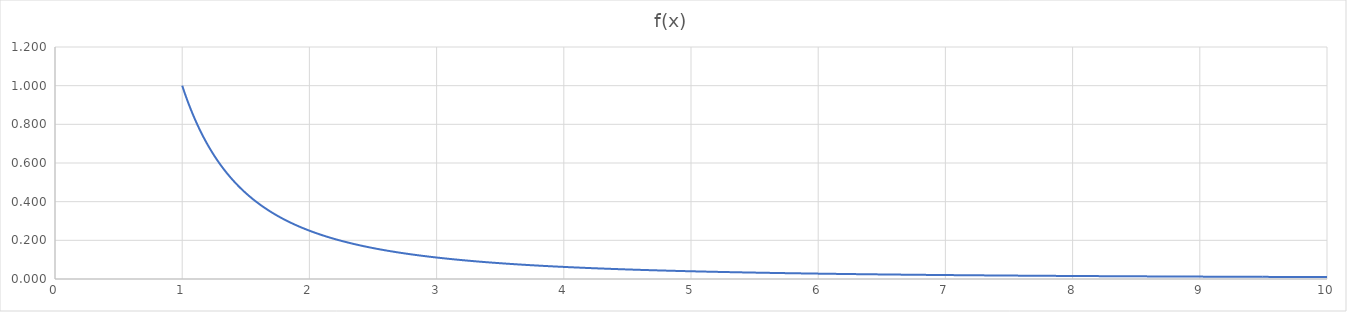
| Category | Series 0 |
|---|---|
| 1.0 | 1 |
| 1.01 | 0.98 |
| 1.02 | 0.961 |
| 1.03 | 0.943 |
| 1.04 | 0.925 |
| 1.05 | 0.907 |
| 1.06 | 0.89 |
| 1.07 | 0.873 |
| 1.08 | 0.857 |
| 1.09 | 0.842 |
| 1.1 | 0.826 |
| 1.11 | 0.812 |
| 1.12 | 0.797 |
| 1.13 | 0.783 |
| 1.14 | 0.769 |
| 1.15 | 0.756 |
| 1.16 | 0.743 |
| 1.17 | 0.731 |
| 1.18 | 0.718 |
| 1.19 | 0.706 |
| 1.2 | 0.694 |
| 1.21 | 0.683 |
| 1.22 | 0.672 |
| 1.23 | 0.661 |
| 1.24 | 0.65 |
| 1.25 | 0.64 |
| 1.26 | 0.63 |
| 1.27 | 0.62 |
| 1.28 | 0.61 |
| 1.29 | 0.601 |
| 1.3 | 0.592 |
| 1.31 | 0.583 |
| 1.32 | 0.574 |
| 1.33 | 0.565 |
| 1.34 | 0.557 |
| 1.35 | 0.549 |
| 1.36 | 0.541 |
| 1.37 | 0.533 |
| 1.38 | 0.525 |
| 1.39 | 0.518 |
| 1.4 | 0.51 |
| 1.41 | 0.503 |
| 1.42 | 0.496 |
| 1.43 | 0.489 |
| 1.44 | 0.482 |
| 1.45 | 0.476 |
| 1.46 | 0.469 |
| 1.47 | 0.463 |
| 1.48 | 0.457 |
| 1.49 | 0.45 |
| 1.5 | 0.444 |
| 1.51 | 0.439 |
| 1.52 | 0.433 |
| 1.53 | 0.427 |
| 1.54 | 0.422 |
| 1.55 | 0.416 |
| 1.56 | 0.411 |
| 1.57 | 0.406 |
| 1.58 | 0.401 |
| 1.59 | 0.396 |
| 1.6 | 0.391 |
| 1.61 | 0.386 |
| 1.62 | 0.381 |
| 1.63 | 0.376 |
| 1.64 | 0.372 |
| 1.65 | 0.367 |
| 1.66 | 0.363 |
| 1.67 | 0.359 |
| 1.68 | 0.354 |
| 1.69 | 0.35 |
| 1.7 | 0.346 |
| 1.71 | 0.342 |
| 1.72 | 0.338 |
| 1.73 | 0.334 |
| 1.74 | 0.33 |
| 1.75 | 0.327 |
| 1.76 | 0.323 |
| 1.77 | 0.319 |
| 1.78 | 0.316 |
| 1.79 | 0.312 |
| 1.8 | 0.309 |
| 1.81 | 0.305 |
| 1.82 | 0.302 |
| 1.83 | 0.299 |
| 1.84 | 0.295 |
| 1.85 | 0.292 |
| 1.86 | 0.289 |
| 1.87 | 0.286 |
| 1.88 | 0.283 |
| 1.89 | 0.28 |
| 1.9 | 0.277 |
| 1.91 | 0.274 |
| 1.92 | 0.271 |
| 1.93 | 0.268 |
| 1.94 | 0.266 |
| 1.95 | 0.263 |
| 1.96 | 0.26 |
| 1.97 | 0.258 |
| 1.98 | 0.255 |
| 1.99 | 0.253 |
| 2.0 | 0.25 |
| 2.01 | 0.248 |
| 2.02 | 0.245 |
| 2.03 | 0.243 |
| 2.04 | 0.24 |
| 2.05 | 0.238 |
| 2.06 | 0.236 |
| 2.07 | 0.233 |
| 2.08 | 0.231 |
| 2.09 | 0.229 |
| 2.1 | 0.227 |
| 2.11 | 0.225 |
| 2.12 | 0.222 |
| 2.13 | 0.22 |
| 2.14 | 0.218 |
| 2.15 | 0.216 |
| 2.16 | 0.214 |
| 2.17 | 0.212 |
| 2.18 | 0.21 |
| 2.19 | 0.209 |
| 2.2 | 0.207 |
| 2.21 | 0.205 |
| 2.22 | 0.203 |
| 2.23 | 0.201 |
| 2.24 | 0.199 |
| 2.25 | 0.198 |
| 2.26 | 0.196 |
| 2.27 | 0.194 |
| 2.28 | 0.192 |
| 2.29 | 0.191 |
| 2.3 | 0.189 |
| 2.31 | 0.187 |
| 2.32 | 0.186 |
| 2.33 | 0.184 |
| 2.34 | 0.183 |
| 2.35 | 0.181 |
| 2.36 | 0.18 |
| 2.37 | 0.178 |
| 2.38 | 0.177 |
| 2.39 | 0.175 |
| 2.4 | 0.174 |
| 2.41 | 0.172 |
| 2.42 | 0.171 |
| 2.43 | 0.169 |
| 2.44 | 0.168 |
| 2.45 | 0.167 |
| 2.46 | 0.165 |
| 2.47 | 0.164 |
| 2.48 | 0.163 |
| 2.49 | 0.161 |
| 2.5 | 0.16 |
| 2.51 | 0.159 |
| 2.52 | 0.157 |
| 2.53 | 0.156 |
| 2.54 | 0.155 |
| 2.55 | 0.154 |
| 2.56 | 0.153 |
| 2.57 | 0.151 |
| 2.58 | 0.15 |
| 2.59 | 0.149 |
| 2.6 | 0.148 |
| 2.61 | 0.147 |
| 2.62 | 0.146 |
| 2.63 | 0.145 |
| 2.64 | 0.143 |
| 2.65 | 0.142 |
| 2.66 | 0.141 |
| 2.67 | 0.14 |
| 2.68 | 0.139 |
| 2.69 | 0.138 |
| 2.7 | 0.137 |
| 2.71 | 0.136 |
| 2.72 | 0.135 |
| 2.73 | 0.134 |
| 2.74 | 0.133 |
| 2.75 | 0.132 |
| 2.76 | 0.131 |
| 2.77 | 0.13 |
| 2.78 | 0.129 |
| 2.79 | 0.128 |
| 2.8 | 0.128 |
| 2.81 | 0.127 |
| 2.82 | 0.126 |
| 2.83 | 0.125 |
| 2.84 | 0.124 |
| 2.85 | 0.123 |
| 2.86 | 0.122 |
| 2.87 | 0.121 |
| 2.88 | 0.121 |
| 2.89 | 0.12 |
| 2.9 | 0.119 |
| 2.91 | 0.118 |
| 2.92 | 0.117 |
| 2.93 | 0.116 |
| 2.94 | 0.116 |
| 2.95 | 0.115 |
| 2.96 | 0.114 |
| 2.97 | 0.113 |
| 2.98 | 0.113 |
| 2.99 | 0.112 |
| 3.0 | 0.111 |
| 3.01 | 0.11 |
| 3.02 | 0.11 |
| 3.03 | 0.109 |
| 3.04 | 0.108 |
| 3.05 | 0.107 |
| 3.06 | 0.107 |
| 3.07 | 0.106 |
| 3.08 | 0.105 |
| 3.09 | 0.105 |
| 3.1 | 0.104 |
| 3.11 | 0.103 |
| 3.12 | 0.103 |
| 3.13 | 0.102 |
| 3.14 | 0.101 |
| 3.15 | 0.101 |
| 3.16 | 0.1 |
| 3.17 | 0.1 |
| 3.18 | 0.099 |
| 3.19 | 0.098 |
| 3.2 | 0.098 |
| 3.21 | 0.097 |
| 3.22 | 0.096 |
| 3.23 | 0.096 |
| 3.24 | 0.095 |
| 3.25 | 0.095 |
| 3.26 | 0.094 |
| 3.27 | 0.094 |
| 3.28 | 0.093 |
| 3.29 | 0.092 |
| 3.3 | 0.092 |
| 3.31 | 0.091 |
| 3.32 | 0.091 |
| 3.33 | 0.09 |
| 3.34 | 0.09 |
| 3.35 | 0.089 |
| 3.36 | 0.089 |
| 3.37 | 0.088 |
| 3.38 | 0.088 |
| 3.39 | 0.087 |
| 3.4 | 0.087 |
| 3.41 | 0.086 |
| 3.42 | 0.085 |
| 3.43 | 0.085 |
| 3.44 | 0.085 |
| 3.45 | 0.084 |
| 3.46 | 0.084 |
| 3.47 | 0.083 |
| 3.48 | 0.083 |
| 3.49 | 0.082 |
| 3.5 | 0.082 |
| 3.51 | 0.081 |
| 3.52 | 0.081 |
| 3.53 | 0.08 |
| 3.54 | 0.08 |
| 3.55 | 0.079 |
| 3.56 | 0.079 |
| 3.57 | 0.078 |
| 3.58 | 0.078 |
| 3.59 | 0.078 |
| 3.6 | 0.077 |
| 3.61 | 0.077 |
| 3.62 | 0.076 |
| 3.63 | 0.076 |
| 3.64 | 0.075 |
| 3.65 | 0.075 |
| 3.66 | 0.075 |
| 3.67 | 0.074 |
| 3.68 | 0.074 |
| 3.69 | 0.073 |
| 3.7 | 0.073 |
| 3.71 | 0.073 |
| 3.72 | 0.072 |
| 3.73 | 0.072 |
| 3.74 | 0.071 |
| 3.75 | 0.071 |
| 3.76 | 0.071 |
| 3.77 | 0.07 |
| 3.78 | 0.07 |
| 3.79 | 0.07 |
| 3.8 | 0.069 |
| 3.81 | 0.069 |
| 3.82 | 0.069 |
| 3.83 | 0.068 |
| 3.84 | 0.068 |
| 3.85 | 0.067 |
| 3.86 | 0.067 |
| 3.87 | 0.067 |
| 3.88 | 0.066 |
| 3.89 | 0.066 |
| 3.9 | 0.066 |
| 3.91 | 0.065 |
| 3.92 | 0.065 |
| 3.93 | 0.065 |
| 3.94 | 0.064 |
| 3.95 | 0.064 |
| 3.96 | 0.064 |
| 3.97 | 0.063 |
| 3.98 | 0.063 |
| 3.99 | 0.063 |
| 4.0 | 0.062 |
| 4.01 | 0.062 |
| 4.02 | 0.062 |
| 4.03 | 0.062 |
| 4.04 | 0.061 |
| 4.05 | 0.061 |
| 4.06 | 0.061 |
| 4.07 | 0.06 |
| 4.08 | 0.06 |
| 4.09 | 0.06 |
| 4.1 | 0.059 |
| 4.11 | 0.059 |
| 4.12 | 0.059 |
| 4.13 | 0.059 |
| 4.14 | 0.058 |
| 4.15 | 0.058 |
| 4.16 | 0.058 |
| 4.17 | 0.058 |
| 4.18 | 0.057 |
| 4.19 | 0.057 |
| 4.2 | 0.057 |
| 4.21 | 0.056 |
| 4.22 | 0.056 |
| 4.23 | 0.056 |
| 4.24 | 0.056 |
| 4.25 | 0.055 |
| 4.26 | 0.055 |
| 4.27 | 0.055 |
| 4.28 | 0.055 |
| 4.29 | 0.054 |
| 4.3 | 0.054 |
| 4.31 | 0.054 |
| 4.32 | 0.054 |
| 4.33 | 0.053 |
| 4.34 | 0.053 |
| 4.35 | 0.053 |
| 4.36 | 0.053 |
| 4.37 | 0.052 |
| 4.38 | 0.052 |
| 4.39 | 0.052 |
| 4.4 | 0.052 |
| 4.41 | 0.051 |
| 4.42 | 0.051 |
| 4.43 | 0.051 |
| 4.44 | 0.051 |
| 4.45 | 0.05 |
| 4.46 | 0.05 |
| 4.47 | 0.05 |
| 4.48 | 0.05 |
| 4.49 | 0.05 |
| 4.5 | 0.049 |
| 4.51 | 0.049 |
| 4.52 | 0.049 |
| 4.53 | 0.049 |
| 4.54 | 0.049 |
| 4.55 | 0.048 |
| 4.56 | 0.048 |
| 4.57 | 0.048 |
| 4.58 | 0.048 |
| 4.59 | 0.047 |
| 4.6 | 0.047 |
| 4.61 | 0.047 |
| 4.62 | 0.047 |
| 4.63 | 0.047 |
| 4.64 | 0.046 |
| 4.65 | 0.046 |
| 4.66 | 0.046 |
| 4.67 | 0.046 |
| 4.68 | 0.046 |
| 4.69 | 0.045 |
| 4.7 | 0.045 |
| 4.71 | 0.045 |
| 4.72 | 0.045 |
| 4.73 | 0.045 |
| 4.74 | 0.045 |
| 4.75 | 0.044 |
| 4.76 | 0.044 |
| 4.77 | 0.044 |
| 4.78 | 0.044 |
| 4.79 | 0.044 |
| 4.8 | 0.043 |
| 4.81 | 0.043 |
| 4.82 | 0.043 |
| 4.83 | 0.043 |
| 4.84 | 0.043 |
| 4.85 | 0.043 |
| 4.86 | 0.042 |
| 4.87 | 0.042 |
| 4.88 | 0.042 |
| 4.89 | 0.042 |
| 4.9 | 0.042 |
| 4.91 | 0.041 |
| 4.92 | 0.041 |
| 4.93 | 0.041 |
| 4.94 | 0.041 |
| 4.95 | 0.041 |
| 4.96 | 0.041 |
| 4.97 | 0.04 |
| 4.98 | 0.04 |
| 4.99 | 0.04 |
| 5.0 | 0.04 |
| 5.01 | 0.04 |
| 5.02 | 0.04 |
| 5.03 | 0.04 |
| 5.04 | 0.039 |
| 5.05 | 0.039 |
| 5.06 | 0.039 |
| 5.07 | 0.039 |
| 5.08 | 0.039 |
| 5.09 | 0.039 |
| 5.1 | 0.038 |
| 5.11 | 0.038 |
| 5.12 | 0.038 |
| 5.13 | 0.038 |
| 5.14 | 0.038 |
| 5.15 | 0.038 |
| 5.16 | 0.038 |
| 5.17 | 0.037 |
| 5.18 | 0.037 |
| 5.19 | 0.037 |
| 5.2 | 0.037 |
| 5.21 | 0.037 |
| 5.22 | 0.037 |
| 5.23 | 0.037 |
| 5.24 | 0.036 |
| 5.25 | 0.036 |
| 5.26 | 0.036 |
| 5.27 | 0.036 |
| 5.28 | 0.036 |
| 5.29 | 0.036 |
| 5.3 | 0.036 |
| 5.31 | 0.035 |
| 5.32 | 0.035 |
| 5.33 | 0.035 |
| 5.34 | 0.035 |
| 5.35 | 0.035 |
| 5.36 | 0.035 |
| 5.37 | 0.035 |
| 5.38 | 0.035 |
| 5.39 | 0.034 |
| 5.4 | 0.034 |
| 5.41 | 0.034 |
| 5.42 | 0.034 |
| 5.43 | 0.034 |
| 5.44 | 0.034 |
| 5.45 | 0.034 |
| 5.46 | 0.034 |
| 5.47 | 0.033 |
| 5.48 | 0.033 |
| 5.49 | 0.033 |
| 5.5 | 0.033 |
| 5.51 | 0.033 |
| 5.52 | 0.033 |
| 5.53 | 0.033 |
| 5.54 | 0.033 |
| 5.55 | 0.032 |
| 5.56 | 0.032 |
| 5.57 | 0.032 |
| 5.58 | 0.032 |
| 5.59 | 0.032 |
| 5.6 | 0.032 |
| 5.61 | 0.032 |
| 5.62 | 0.032 |
| 5.63 | 0.032 |
| 5.64 | 0.031 |
| 5.65 | 0.031 |
| 5.66 | 0.031 |
| 5.67 | 0.031 |
| 5.68 | 0.031 |
| 5.69 | 0.031 |
| 5.7 | 0.031 |
| 5.71 | 0.031 |
| 5.72 | 0.031 |
| 5.73 | 0.03 |
| 5.74 | 0.03 |
| 5.75 | 0.03 |
| 5.76 | 0.03 |
| 5.77 | 0.03 |
| 5.78 | 0.03 |
| 5.79 | 0.03 |
| 5.8 | 0.03 |
| 5.81 | 0.03 |
| 5.82 | 0.03 |
| 5.83 | 0.029 |
| 5.84 | 0.029 |
| 5.85 | 0.029 |
| 5.86 | 0.029 |
| 5.87 | 0.029 |
| 5.88 | 0.029 |
| 5.89 | 0.029 |
| 5.9 | 0.029 |
| 5.91 | 0.029 |
| 5.92 | 0.029 |
| 5.93 | 0.028 |
| 5.94 | 0.028 |
| 5.95 | 0.028 |
| 5.96 | 0.028 |
| 5.97 | 0.028 |
| 5.98 | 0.028 |
| 5.99 | 0.028 |
| 6.0 | 0.028 |
| 6.01 | 0.028 |
| 6.02 | 0.028 |
| 6.03 | 0.028 |
| 6.04 | 0.027 |
| 6.05 | 0.027 |
| 6.06 | 0.027 |
| 6.07 | 0.027 |
| 6.08 | 0.027 |
| 6.09 | 0.027 |
| 6.1 | 0.027 |
| 6.11 | 0.027 |
| 6.12 | 0.027 |
| 6.13 | 0.027 |
| 6.14 | 0.027 |
| 6.15 | 0.026 |
| 6.16 | 0.026 |
| 6.17 | 0.026 |
| 6.18000000000001 | 0.026 |
| 6.19 | 0.026 |
| 6.2 | 0.026 |
| 6.21 | 0.026 |
| 6.22 | 0.026 |
| 6.23 | 0.026 |
| 6.24 | 0.026 |
| 6.25 | 0.026 |
| 6.26000000000001 | 0.026 |
| 6.27 | 0.025 |
| 6.28 | 0.025 |
| 6.29 | 0.025 |
| 6.3 | 0.025 |
| 6.31 | 0.025 |
| 6.32 | 0.025 |
| 6.33 | 0.025 |
| 6.34000000000001 | 0.025 |
| 6.35 | 0.025 |
| 6.36 | 0.025 |
| 6.37 | 0.025 |
| 6.38 | 0.025 |
| 6.39000000000001 | 0.024 |
| 6.4 | 0.024 |
| 6.41 | 0.024 |
| 6.42000000000001 | 0.024 |
| 6.43000000000001 | 0.024 |
| 6.44 | 0.024 |
| 6.45 | 0.024 |
| 6.46 | 0.024 |
| 6.47000000000001 | 0.024 |
| 6.48 | 0.024 |
| 6.49 | 0.024 |
| 6.50000000000001 | 0.024 |
| 6.51000000000001 | 0.024 |
| 6.52 | 0.024 |
| 6.53 | 0.023 |
| 6.54 | 0.023 |
| 6.55000000000001 | 0.023 |
| 6.56 | 0.023 |
| 6.57 | 0.023 |
| 6.58000000000001 | 0.023 |
| 6.59000000000001 | 0.023 |
| 6.6 | 0.023 |
| 6.61 | 0.023 |
| 6.62 | 0.023 |
| 6.63000000000001 | 0.023 |
| 6.64000000000001 | 0.023 |
| 6.65 | 0.023 |
| 6.66000000000001 | 0.023 |
| 6.67000000000001 | 0.022 |
| 6.68000000000001 | 0.022 |
| 6.69 | 0.022 |
| 6.7 | 0.022 |
| 6.71000000000001 | 0.022 |
| 6.72000000000001 | 0.022 |
| 6.73 | 0.022 |
| 6.74000000000001 | 0.022 |
| 6.75000000000001 | 0.022 |
| 6.76000000000001 | 0.022 |
| 6.77 | 0.022 |
| 6.78 | 0.022 |
| 6.79000000000001 | 0.022 |
| 6.80000000000001 | 0.022 |
| 6.81 | 0.022 |
| 6.82000000000001 | 0.021 |
| 6.83000000000001 | 0.021 |
| 6.84000000000001 | 0.021 |
| 6.85 | 0.021 |
| 6.86 | 0.021 |
| 6.87000000000001 | 0.021 |
| 6.88000000000001 | 0.021 |
| 6.89000000000001 | 0.021 |
| 6.90000000000001 | 0.021 |
| 6.91000000000001 | 0.021 |
| 6.92000000000001 | 0.021 |
| 6.93000000000001 | 0.021 |
| 6.94 | 0.021 |
| 6.95000000000001 | 0.021 |
| 6.96000000000001 | 0.021 |
| 6.97000000000001 | 0.021 |
| 6.98000000000001 | 0.021 |
| 6.99000000000001 | 0.02 |
| 7.00000000000001 | 0.02 |
| 7.01000000000001 | 0.02 |
| 7.02 | 0.02 |
| 7.03000000000001 | 0.02 |
| 7.04000000000001 | 0.02 |
| 7.05000000000001 | 0.02 |
| 7.06000000000001 | 0.02 |
| 7.07000000000001 | 0.02 |
| 7.08000000000001 | 0.02 |
| 7.09000000000001 | 0.02 |
| 7.1 | 0.02 |
| 7.11000000000001 | 0.02 |
| 7.12000000000001 | 0.02 |
| 7.13000000000001 | 0.02 |
| 7.14000000000001 | 0.02 |
| 7.15000000000001 | 0.02 |
| 7.16000000000001 | 0.02 |
| 7.17000000000001 | 0.019 |
| 7.18000000000001 | 0.019 |
| 7.19000000000001 | 0.019 |
| 7.20000000000001 | 0.019 |
| 7.21000000000001 | 0.019 |
| 7.22000000000001 | 0.019 |
| 7.23000000000001 | 0.019 |
| 7.24000000000001 | 0.019 |
| 7.25000000000001 | 0.019 |
| 7.26000000000001 | 0.019 |
| 7.27000000000001 | 0.019 |
| 7.28000000000001 | 0.019 |
| 7.29000000000001 | 0.019 |
| 7.30000000000001 | 0.019 |
| 7.31000000000001 | 0.019 |
| 7.32000000000001 | 0.019 |
| 7.33000000000001 | 0.019 |
| 7.34000000000001 | 0.019 |
| 7.35000000000001 | 0.019 |
| 7.36000000000001 | 0.018 |
| 7.37000000000001 | 0.018 |
| 7.38000000000001 | 0.018 |
| 7.39000000000001 | 0.018 |
| 7.40000000000001 | 0.018 |
| 7.41000000000001 | 0.018 |
| 7.42000000000001 | 0.018 |
| 7.43000000000001 | 0.018 |
| 7.44000000000001 | 0.018 |
| 7.45000000000001 | 0.018 |
| 7.46000000000001 | 0.018 |
| 7.47000000000001 | 0.018 |
| 7.48000000000001 | 0.018 |
| 7.49000000000001 | 0.018 |
| 7.50000000000001 | 0.018 |
| 7.51000000000001 | 0.018 |
| 7.52000000000001 | 0.018 |
| 7.53000000000001 | 0.018 |
| 7.54000000000001 | 0.018 |
| 7.55000000000001 | 0.018 |
| 7.56000000000001 | 0.017 |
| 7.57000000000001 | 0.017 |
| 7.58000000000001 | 0.017 |
| 7.59000000000001 | 0.017 |
| 7.60000000000001 | 0.017 |
| 7.61000000000001 | 0.017 |
| 7.62000000000001 | 0.017 |
| 7.63000000000001 | 0.017 |
| 7.64000000000001 | 0.017 |
| 7.65000000000001 | 0.017 |
| 7.66000000000001 | 0.017 |
| 7.67000000000001 | 0.017 |
| 7.68000000000001 | 0.017 |
| 7.69000000000001 | 0.017 |
| 7.70000000000001 | 0.017 |
| 7.71000000000001 | 0.017 |
| 7.72000000000001 | 0.017 |
| 7.73000000000001 | 0.017 |
| 7.74000000000001 | 0.017 |
| 7.75000000000001 | 0.017 |
| 7.76000000000001 | 0.017 |
| 7.77000000000001 | 0.017 |
| 7.78000000000001 | 0.017 |
| 7.79000000000001 | 0.016 |
| 7.80000000000001 | 0.016 |
| 7.81000000000001 | 0.016 |
| 7.82000000000001 | 0.016 |
| 7.83000000000001 | 0.016 |
| 7.84000000000001 | 0.016 |
| 7.85000000000001 | 0.016 |
| 7.86000000000001 | 0.016 |
| 7.87000000000001 | 0.016 |
| 7.88000000000001 | 0.016 |
| 7.89000000000001 | 0.016 |
| 7.90000000000001 | 0.016 |
| 7.91000000000001 | 0.016 |
| 7.92000000000001 | 0.016 |
| 7.93000000000001 | 0.016 |
| 7.94000000000001 | 0.016 |
| 7.95000000000001 | 0.016 |
| 7.96000000000001 | 0.016 |
| 7.97000000000001 | 0.016 |
| 7.98000000000001 | 0.016 |
| 7.99000000000001 | 0.016 |
| 8.00000000000001 | 0.016 |
| 8.01000000000001 | 0.016 |
| 8.02000000000001 | 0.016 |
| 8.03000000000001 | 0.016 |
| 8.04000000000001 | 0.015 |
| 8.05000000000001 | 0.015 |
| 8.06000000000001 | 0.015 |
| 8.07000000000001 | 0.015 |
| 8.08000000000001 | 0.015 |
| 8.09000000000001 | 0.015 |
| 8.10000000000001 | 0.015 |
| 8.11000000000001 | 0.015 |
| 8.12000000000001 | 0.015 |
| 8.13000000000001 | 0.015 |
| 8.14000000000001 | 0.015 |
| 8.15000000000001 | 0.015 |
| 8.16000000000001 | 0.015 |
| 8.17000000000001 | 0.015 |
| 8.18000000000001 | 0.015 |
| 8.19000000000001 | 0.015 |
| 8.20000000000001 | 0.015 |
| 8.21000000000001 | 0.015 |
| 8.22000000000001 | 0.015 |
| 8.23000000000001 | 0.015 |
| 8.24000000000001 | 0.015 |
| 8.25000000000001 | 0.015 |
| 8.26000000000001 | 0.015 |
| 8.27000000000001 | 0.015 |
| 8.28000000000001 | 0.015 |
| 8.29000000000001 | 0.015 |
| 8.30000000000001 | 0.015 |
| 8.31000000000001 | 0.014 |
| 8.32000000000001 | 0.014 |
| 8.33000000000001 | 0.014 |
| 8.34000000000001 | 0.014 |
| 8.35000000000001 | 0.014 |
| 8.36000000000001 | 0.014 |
| 8.37000000000001 | 0.014 |
| 8.38000000000001 | 0.014 |
| 8.39000000000001 | 0.014 |
| 8.40000000000001 | 0.014 |
| 8.41000000000001 | 0.014 |
| 8.42000000000001 | 0.014 |
| 8.43000000000001 | 0.014 |
| 8.44000000000001 | 0.014 |
| 8.45000000000001 | 0.014 |
| 8.46000000000001 | 0.014 |
| 8.47000000000001 | 0.014 |
| 8.48000000000001 | 0.014 |
| 8.49000000000001 | 0.014 |
| 8.50000000000001 | 0.014 |
| 8.51000000000001 | 0.014 |
| 8.52000000000001 | 0.014 |
| 8.53000000000001 | 0.014 |
| 8.54000000000001 | 0.014 |
| 8.55000000000001 | 0.014 |
| 8.56000000000001 | 0.014 |
| 8.57000000000001 | 0.014 |
| 8.58000000000001 | 0.014 |
| 8.59000000000001 | 0.014 |
| 8.60000000000001 | 0.014 |
| 8.61000000000001 | 0.013 |
| 8.62000000000001 | 0.013 |
| 8.63000000000001 | 0.013 |
| 8.64000000000001 | 0.013 |
| 8.65000000000001 | 0.013 |
| 8.66000000000001 | 0.013 |
| 8.67000000000001 | 0.013 |
| 8.68000000000001 | 0.013 |
| 8.69000000000001 | 0.013 |
| 8.70000000000001 | 0.013 |
| 8.71000000000001 | 0.013 |
| 8.72000000000001 | 0.013 |
| 8.73000000000001 | 0.013 |
| 8.74000000000001 | 0.013 |
| 8.75000000000001 | 0.013 |
| 8.76000000000001 | 0.013 |
| 8.77000000000001 | 0.013 |
| 8.78000000000001 | 0.013 |
| 8.79000000000001 | 0.013 |
| 8.80000000000001 | 0.013 |
| 8.81000000000001 | 0.013 |
| 8.82000000000001 | 0.013 |
| 8.83000000000001 | 0.013 |
| 8.84000000000001 | 0.013 |
| 8.85000000000001 | 0.013 |
| 8.86000000000001 | 0.013 |
| 8.87000000000001 | 0.013 |
| 8.88000000000001 | 0.013 |
| 8.89000000000001 | 0.013 |
| 8.90000000000001 | 0.013 |
| 8.91000000000001 | 0.013 |
| 8.92000000000001 | 0.013 |
| 8.93000000000001 | 0.013 |
| 8.94000000000001 | 0.013 |
| 8.95000000000001 | 0.012 |
| 8.96000000000001 | 0.012 |
| 8.97000000000001 | 0.012 |
| 8.98000000000001 | 0.012 |
| 8.99000000000001 | 0.012 |
| 9.00000000000001 | 0.012 |
| 9.01000000000001 | 0.012 |
| 9.02000000000001 | 0.012 |
| 9.03000000000001 | 0.012 |
| 9.04000000000001 | 0.012 |
| 9.05000000000001 | 0.012 |
| 9.06000000000001 | 0.012 |
| 9.07000000000001 | 0.012 |
| 9.08000000000001 | 0.012 |
| 9.09000000000001 | 0.012 |
| 9.10000000000001 | 0.012 |
| 9.11000000000001 | 0.012 |
| 9.12000000000001 | 0.012 |
| 9.13000000000001 | 0.012 |
| 9.14000000000001 | 0.012 |
| 9.15000000000001 | 0.012 |
| 9.16000000000001 | 0.012 |
| 9.17000000000001 | 0.012 |
| 9.18000000000001 | 0.012 |
| 9.19000000000001 | 0.012 |
| 9.20000000000001 | 0.012 |
| 9.21000000000001 | 0.012 |
| 9.22000000000001 | 0.012 |
| 9.23000000000001 | 0.012 |
| 9.24000000000001 | 0.012 |
| 9.25000000000001 | 0.012 |
| 9.26000000000001 | 0.012 |
| 9.27000000000001 | 0.012 |
| 9.28000000000001 | 0.012 |
| 9.29000000000001 | 0.012 |
| 9.30000000000001 | 0.012 |
| 9.31000000000001 | 0.012 |
| 9.32000000000001 | 0.012 |
| 9.33000000000001 | 0.011 |
| 9.34000000000001 | 0.011 |
| 9.35000000000001 | 0.011 |
| 9.36000000000001 | 0.011 |
| 9.37000000000001 | 0.011 |
| 9.38000000000001 | 0.011 |
| 9.39000000000001 | 0.011 |
| 9.40000000000001 | 0.011 |
| 9.41000000000001 | 0.011 |
| 9.42000000000001 | 0.011 |
| 9.43000000000001 | 0.011 |
| 9.44000000000001 | 0.011 |
| 9.45000000000001 | 0.011 |
| 9.46000000000001 | 0.011 |
| 9.47000000000001 | 0.011 |
| 9.48000000000001 | 0.011 |
| 9.49000000000001 | 0.011 |
| 9.50000000000001 | 0.011 |
| 9.51000000000001 | 0.011 |
| 9.52000000000001 | 0.011 |
| 9.53000000000001 | 0.011 |
| 9.54000000000001 | 0.011 |
| 9.55000000000001 | 0.011 |
| 9.56000000000001 | 0.011 |
| 9.57000000000001 | 0.011 |
| 9.58000000000001 | 0.011 |
| 9.59000000000001 | 0.011 |
| 9.60000000000001 | 0.011 |
| 9.61000000000001 | 0.011 |
| 9.62000000000001 | 0.011 |
| 9.63000000000001 | 0.011 |
| 9.64000000000001 | 0.011 |
| 9.65000000000001 | 0.011 |
| 9.66000000000001 | 0.011 |
| 9.67000000000001 | 0.011 |
| 9.68000000000001 | 0.011 |
| 9.69000000000001 | 0.011 |
| 9.70000000000001 | 0.011 |
| 9.71000000000001 | 0.011 |
| 9.72000000000001 | 0.011 |
| 9.73000000000001 | 0.011 |
| 9.74000000000001 | 0.011 |
| 9.75000000000001 | 0.011 |
| 9.76000000000001 | 0.01 |
| 9.77000000000001 | 0.01 |
| 9.78000000000001 | 0.01 |
| 9.79000000000001 | 0.01 |
| 9.80000000000001 | 0.01 |
| 9.81000000000001 | 0.01 |
| 9.82000000000001 | 0.01 |
| 9.83000000000001 | 0.01 |
| 9.84000000000001 | 0.01 |
| 9.85000000000001 | 0.01 |
| 9.86000000000001 | 0.01 |
| 9.87000000000001 | 0.01 |
| 9.88000000000001 | 0.01 |
| 9.89000000000001 | 0.01 |
| 9.90000000000001 | 0.01 |
| 9.91000000000001 | 0.01 |
| 9.92000000000001 | 0.01 |
| 9.93000000000001 | 0.01 |
| 9.94000000000001 | 0.01 |
| 9.95000000000001 | 0.01 |
| 9.96000000000001 | 0.01 |
| 9.97000000000001 | 0.01 |
| 9.98000000000001 | 0.01 |
| 9.99000000000001 | 0.01 |
| 10.0 | 0.01 |